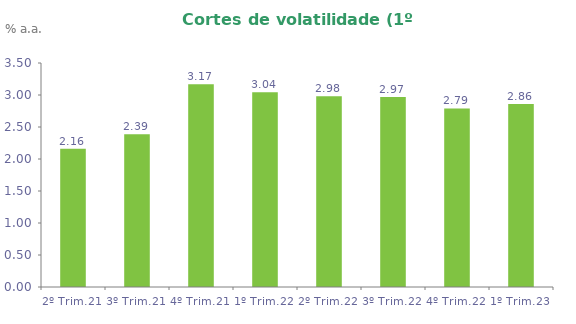
| Category | Series 0 |
|---|---|
| 2º Trim.21 | 2.162 |
| 3º Trim.21 | 2.387 |
| 4º Trim.21 | 3.166 |
| 1º Trim.22 | 3.042 |
| 2º Trim.22 | 2.981 |
| 3º Trim.22 | 2.97 |
| 4º Trim.22 | 2.79 |
| 1º Trim.23 | 2.86 |